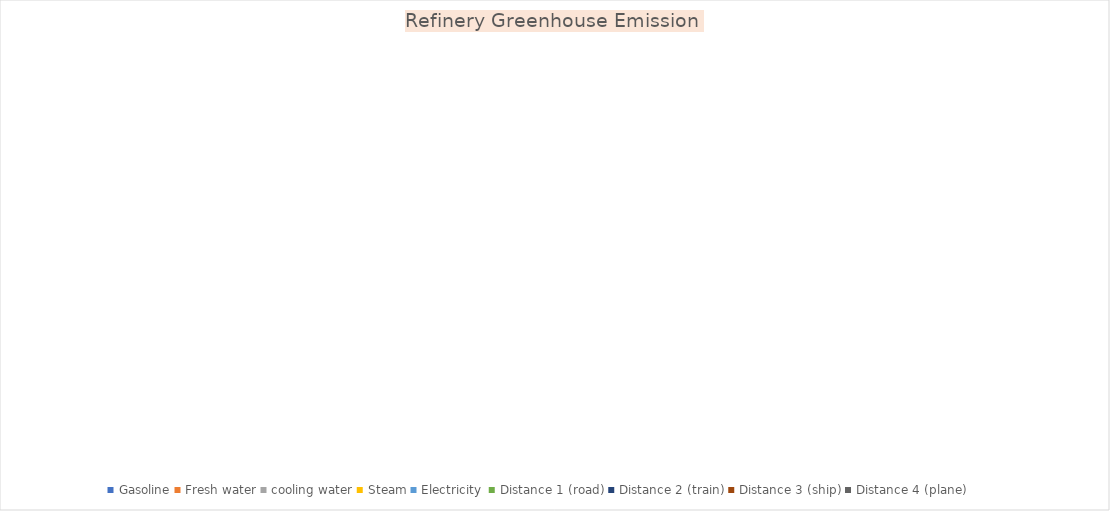
| Category | Greenhouse Emission  |
|---|---|
| Gasoline | 0 |
| Fresh water | 0 |
| cooling water | 0 |
| Steam | 0 |
| Electricity  | 0 |
| Distance 1 (road) | 0 |
| Distance 2 (train) | 0 |
| Distance 3 (ship) | 0 |
| Distance 4 (plane) | 0 |